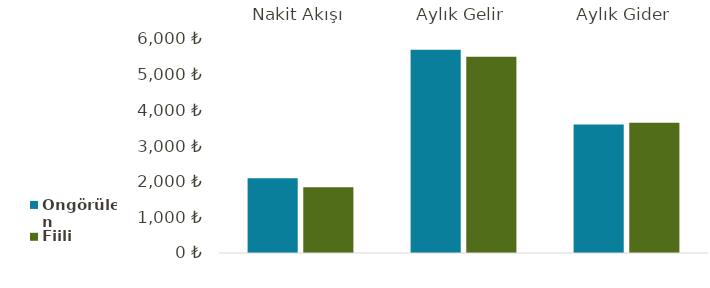
| Category | Öngörülen | Fiili |
|---|---|---|
| Nakit Akışı | 2097 | 1845 |
| Aylık Gelir | 5700 | 5500 |
| Aylık Gider | 3603 | 3655 |